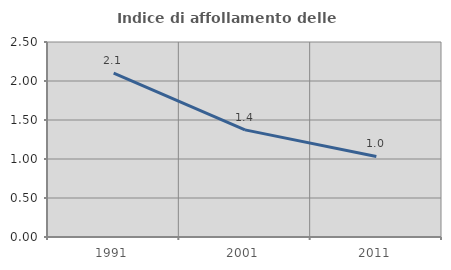
| Category | Indice di affollamento delle abitazioni  |
|---|---|
| 1991.0 | 2.101 |
| 2001.0 | 1.374 |
| 2011.0 | 1.033 |